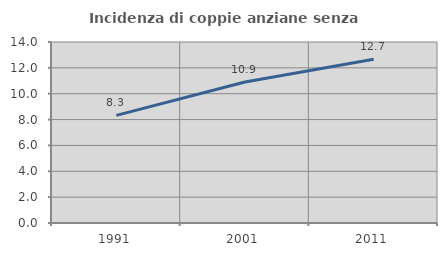
| Category | Incidenza di coppie anziane senza figli  |
|---|---|
| 1991.0 | 8.322 |
| 2001.0 | 10.904 |
| 2011.0 | 12.673 |